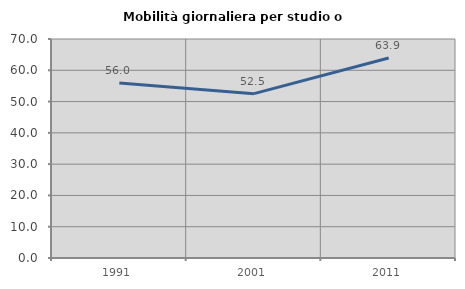
| Category | Mobilità giornaliera per studio o lavoro |
|---|---|
| 1991.0 | 55.965 |
| 2001.0 | 52.528 |
| 2011.0 | 63.907 |